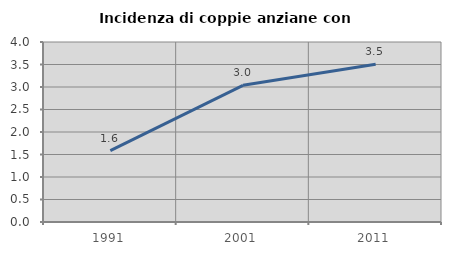
| Category | Incidenza di coppie anziane con figli |
|---|---|
| 1991.0 | 1.587 |
| 2001.0 | 3.037 |
| 2011.0 | 3.506 |